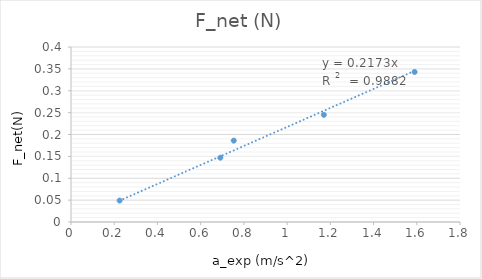
| Category | F_net (N) |
|---|---|
| 0.225 | 0.049 |
| 0.691 | 0.147 |
| 0.753 | 0.186 |
| 1.17 | 0.245 |
| 1.59 | 0.343 |